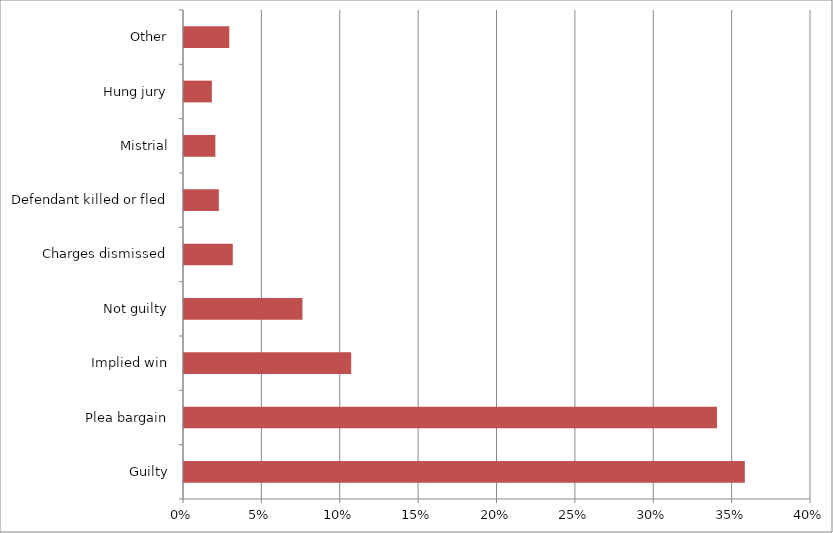
| Category | Series 1 |
|---|---|
| Guilty | 0.358 |
| Plea bargain | 0.34 |
| Implied win | 0.107 |
| Not guilty | 0.076 |
| Charges dismissed | 0.031 |
| Defendant killed or fled | 0.022 |
| Mistrial | 0.02 |
| Hung jury | 0.018 |
| Other | 0.029 |